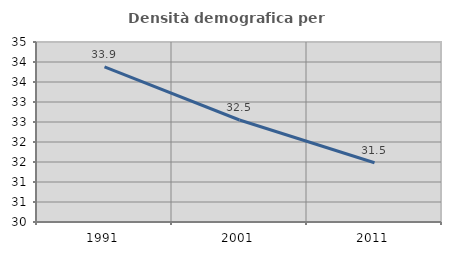
| Category | Densità demografica |
|---|---|
| 1991.0 | 33.878 |
| 2001.0 | 32.55 |
| 2011.0 | 31.481 |